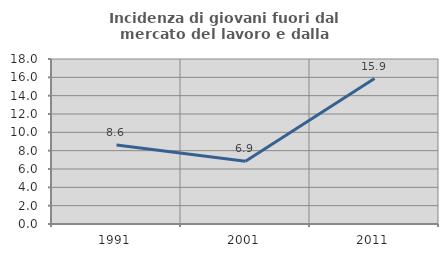
| Category | Incidenza di giovani fuori dal mercato del lavoro e dalla formazione  |
|---|---|
| 1991.0 | 8.621 |
| 2001.0 | 6.857 |
| 2011.0 | 15.862 |